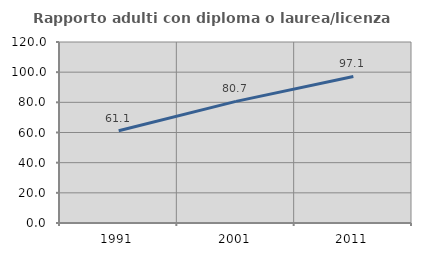
| Category | Rapporto adulti con diploma o laurea/licenza media  |
|---|---|
| 1991.0 | 61.111 |
| 2001.0 | 80.653 |
| 2011.0 | 97.149 |